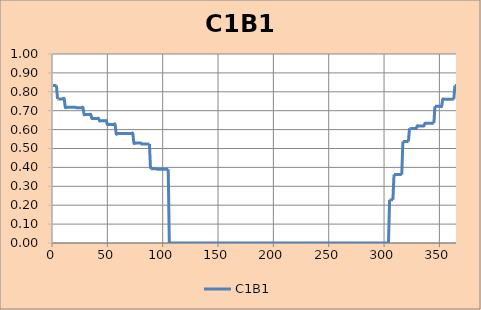
| Category | C1B1 |
|---|---|
| 1.0 | 0.833 |
| 2.0 | 0.833 |
| 3.0 | 0.833 |
| 4.0 | 0.833 |
| 5.0 | 0.763 |
| 6.0 | 0.763 |
| 7.0 | 0.763 |
| 8.0 | 0.763 |
| 9.0 | 0.763 |
| 10.0 | 0.763 |
| 11.0 | 0.763 |
| 12.0 | 0.718 |
| 13.0 | 0.718 |
| 14.0 | 0.718 |
| 15.0 | 0.718 |
| 16.0 | 0.718 |
| 17.0 | 0.718 |
| 18.0 | 0.718 |
| 19.0 | 0.718 |
| 20.0 | 0.718 |
| 21.0 | 0.718 |
| 22.0 | 0.716 |
| 23.0 | 0.716 |
| 24.0 | 0.716 |
| 25.0 | 0.716 |
| 26.0 | 0.716 |
| 27.0 | 0.716 |
| 28.0 | 0.716 |
| 29.0 | 0.68 |
| 30.0 | 0.68 |
| 31.0 | 0.68 |
| 32.0 | 0.68 |
| 33.0 | 0.68 |
| 34.0 | 0.68 |
| 35.0 | 0.68 |
| 36.0 | 0.659 |
| 37.0 | 0.659 |
| 38.0 | 0.659 |
| 39.0 | 0.659 |
| 40.0 | 0.659 |
| 41.0 | 0.659 |
| 42.0 | 0.659 |
| 43.0 | 0.646 |
| 44.0 | 0.646 |
| 45.0 | 0.646 |
| 46.0 | 0.646 |
| 47.0 | 0.646 |
| 48.0 | 0.646 |
| 49.0 | 0.646 |
| 50.0 | 0.627 |
| 51.0 | 0.627 |
| 52.0 | 0.627 |
| 53.0 | 0.627 |
| 54.0 | 0.627 |
| 55.0 | 0.627 |
| 56.0 | 0.627 |
| 57.0 | 0.627 |
| 58.0 | 0.579 |
| 59.0 | 0.579 |
| 60.0 | 0.579 |
| 61.0 | 0.579 |
| 62.0 | 0.579 |
| 63.0 | 0.579 |
| 64.0 | 0.579 |
| 65.0 | 0.579 |
| 66.0 | 0.579 |
| 67.0 | 0.579 |
| 68.0 | 0.579 |
| 69.0 | 0.579 |
| 70.0 | 0.579 |
| 71.0 | 0.579 |
| 72.0 | 0.579 |
| 73.0 | 0.579 |
| 74.0 | 0.529 |
| 75.0 | 0.529 |
| 76.0 | 0.529 |
| 77.0 | 0.529 |
| 78.0 | 0.529 |
| 79.0 | 0.529 |
| 80.0 | 0.529 |
| 81.0 | 0.524 |
| 82.0 | 0.524 |
| 83.0 | 0.524 |
| 84.0 | 0.524 |
| 85.0 | 0.524 |
| 86.0 | 0.524 |
| 87.0 | 0.524 |
| 88.0 | 0.524 |
| 89.0 | 0.393 |
| 90.0 | 0.393 |
| 91.0 | 0.393 |
| 92.0 | 0.393 |
| 93.0 | 0.393 |
| 94.0 | 0.393 |
| 95.0 | 0.391 |
| 96.0 | 0.391 |
| 97.0 | 0.391 |
| 98.0 | 0.391 |
| 99.0 | 0.391 |
| 100.0 | 0.391 |
| 101.0 | 0.391 |
| 102.0 | 0.391 |
| 103.0 | 0.391 |
| 104.0 | 0.391 |
| 105.0 | 0.391 |
| 106.0 | 0 |
| 107.0 | 0 |
| 108.0 | 0 |
| 109.0 | 0 |
| 110.0 | 0 |
| 111.0 | 0 |
| 112.0 | 0 |
| 113.0 | 0 |
| 114.0 | 0 |
| 115.0 | 0 |
| 116.0 | 0 |
| 117.0 | 0 |
| 118.0 | 0 |
| 119.0 | 0 |
| 120.0 | 0 |
| 121.0 | 0 |
| 122.0 | 0 |
| 123.0 | 0 |
| 124.0 | 0 |
| 125.0 | 0 |
| 126.0 | 0 |
| 127.0 | 0 |
| 128.0 | 0 |
| 129.0 | 0 |
| 130.0 | 0 |
| 131.0 | 0 |
| 132.0 | 0 |
| 133.0 | 0 |
| 134.0 | 0 |
| 135.0 | 0 |
| 136.0 | 0 |
| 137.0 | 0 |
| 138.0 | 0 |
| 139.0 | 0 |
| 140.0 | 0 |
| 141.0 | 0 |
| 142.0 | 0 |
| 143.0 | 0 |
| 144.0 | 0 |
| 145.0 | 0 |
| 146.0 | 0 |
| 147.0 | 0 |
| 148.0 | 0 |
| 149.0 | 0 |
| 150.0 | 0 |
| 151.0 | 0 |
| 152.0 | 0 |
| 153.0 | 0 |
| 154.0 | 0 |
| 155.0 | 0 |
| 156.0 | 0 |
| 157.0 | 0 |
| 158.0 | 0 |
| 159.0 | 0 |
| 160.0 | 0 |
| 161.0 | 0 |
| 162.0 | 0 |
| 163.0 | 0 |
| 164.0 | 0 |
| 165.0 | 0 |
| 166.0 | 0 |
| 167.0 | 0 |
| 168.0 | 0 |
| 169.0 | 0 |
| 170.0 | 0 |
| 171.0 | 0 |
| 172.0 | 0 |
| 173.0 | 0 |
| 174.0 | 0 |
| 175.0 | 0 |
| 176.0 | 0 |
| 177.0 | 0 |
| 178.0 | 0 |
| 179.0 | 0 |
| 180.0 | 0 |
| 181.0 | 0 |
| 182.0 | 0 |
| 183.0 | 0 |
| 184.0 | 0 |
| 185.0 | 0 |
| 186.0 | 0 |
| 187.0 | 0 |
| 188.0 | 0 |
| 189.0 | 0 |
| 190.0 | 0 |
| 191.0 | 0 |
| 192.0 | 0 |
| 193.0 | 0 |
| 194.0 | 0 |
| 195.0 | 0 |
| 196.0 | 0 |
| 197.0 | 0 |
| 198.0 | 0 |
| 199.0 | 0 |
| 200.0 | 0 |
| 201.0 | 0 |
| 202.0 | 0 |
| 203.0 | 0 |
| 204.0 | 0 |
| 205.0 | 0 |
| 206.0 | 0 |
| 207.0 | 0 |
| 208.0 | 0 |
| 209.0 | 0 |
| 210.0 | 0 |
| 211.0 | 0 |
| 212.0 | 0 |
| 213.0 | 0 |
| 214.0 | 0 |
| 215.0 | 0 |
| 216.0 | 0 |
| 217.0 | 0 |
| 218.0 | 0 |
| 219.0 | 0 |
| 220.0 | 0 |
| 221.0 | 0 |
| 222.0 | 0 |
| 223.0 | 0 |
| 224.0 | 0 |
| 225.0 | 0 |
| 226.0 | 0 |
| 227.0 | 0 |
| 228.0 | 0 |
| 229.0 | 0 |
| 230.0 | 0 |
| 231.0 | 0 |
| 232.0 | 0 |
| 233.0 | 0 |
| 234.0 | 0 |
| 235.0 | 0 |
| 236.0 | 0 |
| 237.0 | 0 |
| 238.0 | 0 |
| 239.0 | 0 |
| 240.0 | 0 |
| 241.0 | 0 |
| 242.0 | 0 |
| 243.0 | 0 |
| 244.0 | 0 |
| 245.0 | 0 |
| 246.0 | 0 |
| 247.0 | 0 |
| 248.0 | 0 |
| 249.0 | 0 |
| 250.0 | 0 |
| 251.0 | 0 |
| 252.0 | 0 |
| 253.0 | 0 |
| 254.0 | 0 |
| 255.0 | 0 |
| 256.0 | 0 |
| 257.0 | 0 |
| 258.0 | 0 |
| 259.0 | 0 |
| 260.0 | 0 |
| 261.0 | 0 |
| 262.0 | 0 |
| 263.0 | 0 |
| 264.0 | 0 |
| 265.0 | 0 |
| 266.0 | 0 |
| 267.0 | 0 |
| 268.0 | 0 |
| 269.0 | 0 |
| 270.0 | 0 |
| 271.0 | 0 |
| 272.0 | 0 |
| 273.0 | 0 |
| 274.0 | 0 |
| 275.0 | 0 |
| 276.0 | 0 |
| 277.0 | 0 |
| 278.0 | 0 |
| 279.0 | 0 |
| 280.0 | 0 |
| 281.0 | 0 |
| 282.0 | 0 |
| 283.0 | 0 |
| 284.0 | 0 |
| 285.0 | 0 |
| 286.0 | 0 |
| 287.0 | 0 |
| 288.0 | 0 |
| 289.0 | 0 |
| 290.0 | 0 |
| 291.0 | 0 |
| 292.0 | 0 |
| 293.0 | 0 |
| 294.0 | 0 |
| 295.0 | 0 |
| 296.0 | 0 |
| 297.0 | 0 |
| 298.0 | 0 |
| 299.0 | 0 |
| 300.0 | 0 |
| 301.0 | 0 |
| 302.0 | 0 |
| 303.0 | 0 |
| 304.0 | 0 |
| 305.0 | 0.229 |
| 306.0 | 0.229 |
| 307.0 | 0.229 |
| 308.0 | 0.229 |
| 309.0 | 0.362 |
| 310.0 | 0.362 |
| 311.0 | 0.362 |
| 312.0 | 0.362 |
| 313.0 | 0.362 |
| 314.0 | 0.362 |
| 315.0 | 0.362 |
| 316.0 | 0.362 |
| 317.0 | 0.537 |
| 318.0 | 0.537 |
| 319.0 | 0.537 |
| 320.0 | 0.537 |
| 321.0 | 0.537 |
| 322.0 | 0.537 |
| 323.0 | 0.606 |
| 324.0 | 0.606 |
| 325.0 | 0.606 |
| 326.0 | 0.606 |
| 327.0 | 0.606 |
| 328.0 | 0.606 |
| 329.0 | 0.606 |
| 330.0 | 0.619 |
| 331.0 | 0.619 |
| 332.0 | 0.619 |
| 333.0 | 0.619 |
| 334.0 | 0.619 |
| 335.0 | 0.619 |
| 336.0 | 0.619 |
| 337.0 | 0.633 |
| 338.0 | 0.633 |
| 339.0 | 0.633 |
| 340.0 | 0.633 |
| 341.0 | 0.633 |
| 342.0 | 0.633 |
| 343.0 | 0.633 |
| 344.0 | 0.633 |
| 345.0 | 0.633 |
| 346.0 | 0.724 |
| 347.0 | 0.724 |
| 348.0 | 0.724 |
| 349.0 | 0.724 |
| 350.0 | 0.724 |
| 351.0 | 0.724 |
| 352.0 | 0.724 |
| 353.0 | 0.76 |
| 354.0 | 0.76 |
| 355.0 | 0.76 |
| 356.0 | 0.76 |
| 357.0 | 0.76 |
| 358.0 | 0.76 |
| 359.0 | 0.76 |
| 360.0 | 0.76 |
| 361.0 | 0.76 |
| 362.0 | 0.76 |
| 363.0 | 0.76 |
| 364.0 | 0.833 |
| 365.0 | 0.833 |